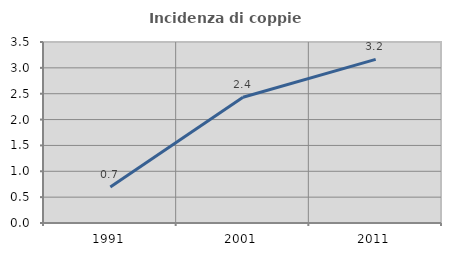
| Category | Incidenza di coppie miste |
|---|---|
| 1991.0 | 0.696 |
| 2001.0 | 2.431 |
| 2011.0 | 3.164 |